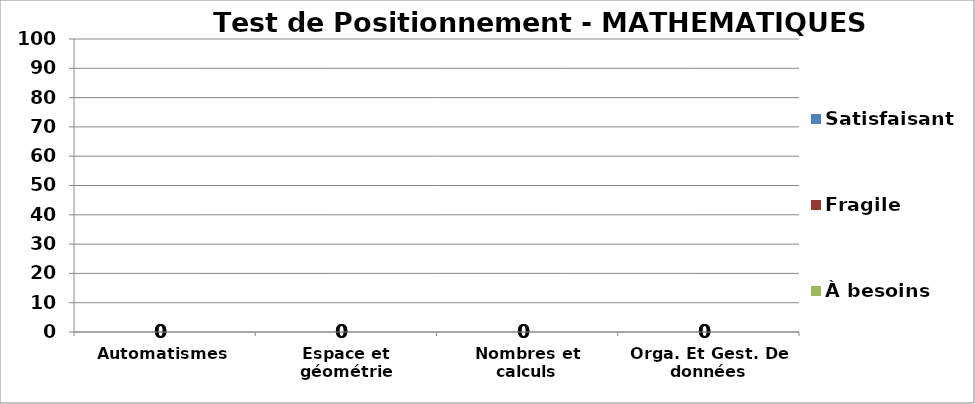
| Category | À besoins | Fragile | Satisfaisant |
|---|---|---|---|
| Automatismes | 0 | 0 | 0 |
| Espace et géométrie | 0 | 0 | 0 |
| Nombres et calculs | 0 | 0 | 0 |
| Orga. Et Gest. De données | 0 | 0 | 0 |